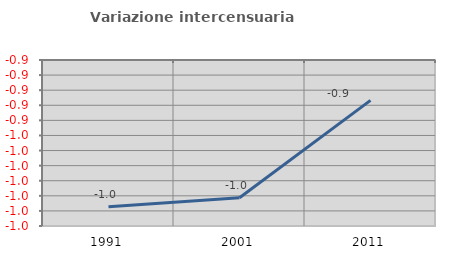
| Category | Variazione intercensuaria annua |
|---|---|
| 1991.0 | -0.997 |
| 2001.0 | -0.991 |
| 2011.0 | -0.927 |